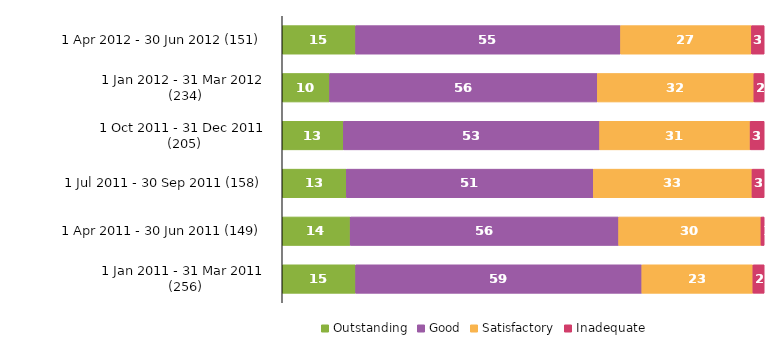
| Category | Outstanding | Good | Satisfactory | Inadequate |
|---|---|---|---|---|
| 1 Apr 2012 - 30 Jun 2012 (151) | 15.232 | 54.967 | 27.152 | 2.649 |
| 1 Jan 2012 - 31 Mar 2012 (234) | 9.829 | 55.556 | 32.479 | 2.137 |
| 1 Oct 2011 - 31 Dec 2011 (205) | 12.683 | 53.171 | 31.22 | 2.927 |
| 1 Jul 2011 - 30 Sep 2011 (158) | 13.291 | 51.266 | 32.911 | 2.532 |
| 1 Apr 2011 - 30 Jun 2011 (149) | 14.094 | 55.705 | 29.53 | 0.671 |
| 1 Jan 2011 - 31 Mar 2011 (256) | 15.234 | 59.375 | 23.047 | 2.344 |